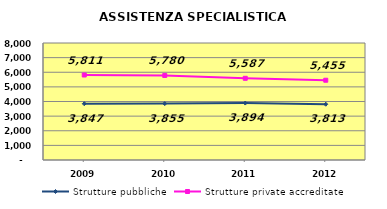
| Category | Strutture pubbliche | Strutture private accreditate |
|---|---|---|
| 2009.0 | 3847 | 5811 |
| 2010.0 | 3855 | 5780 |
| 2011.0 | 3894 | 5587 |
| 2012.0 | 3813 | 5455 |